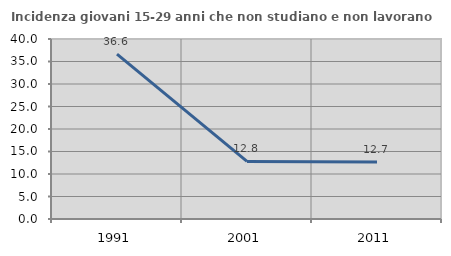
| Category | Incidenza giovani 15-29 anni che non studiano e non lavorano  |
|---|---|
| 1991.0 | 36.649 |
| 2001.0 | 12.791 |
| 2011.0 | 12.676 |